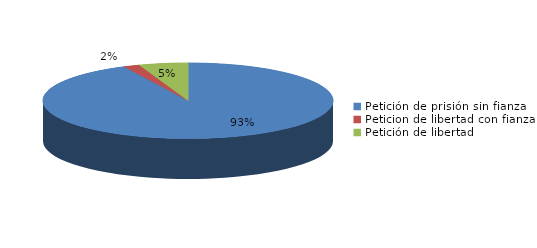
| Category | Series 0 |
|---|---|
| Petición de prisión sin fianza | 51 |
| Peticion de libertad con fianza | 1 |
| Petición de libertad | 3 |